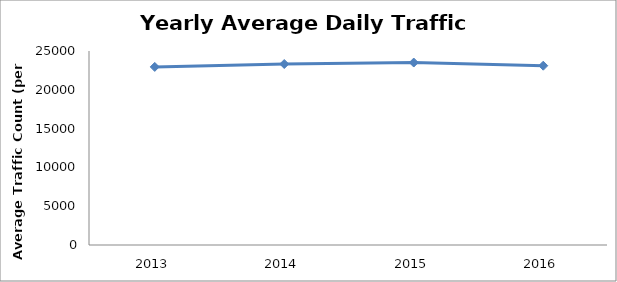
| Category | Series 0 |
|---|---|
| 2013.0 | 22949.611 |
| 2014.0 | 23323.414 |
| 2015.0 | 23513.97 |
| 2016.0 | 23105.011 |